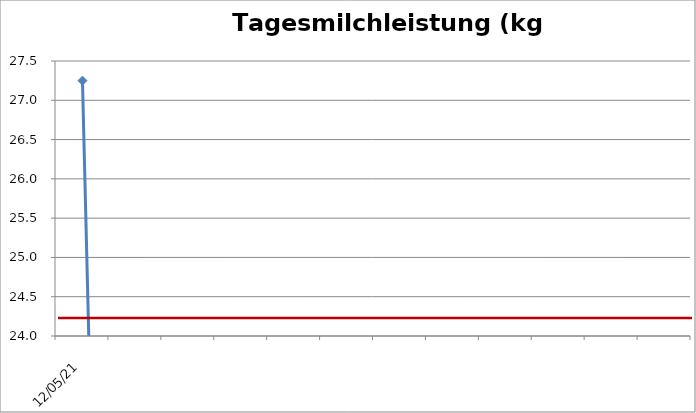
| Category | Tagesmilchleistung (kg Milch/Kuh/Tag) |
|---|---|
| 12.05.21 | 27.25 |
|    | 0 |
|    | 0 |
|    | 0 |
|    | 0 |
|    | 0 |
|    | 0 |
|    | 0 |
|    | 0 |
|    | 0 |
|    | 0 |
|    | 0 |